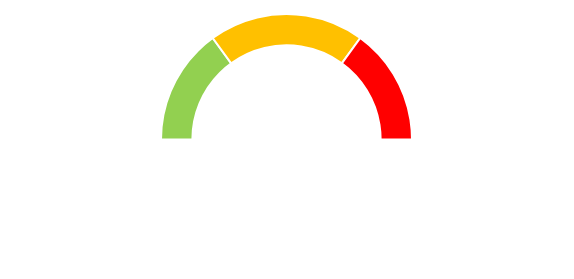
| Category | Series 0 |
|---|---|
| Bílá | 50 |
| Zelená | 15 |
| Oranžová | 20 |
| Červená | 15 |